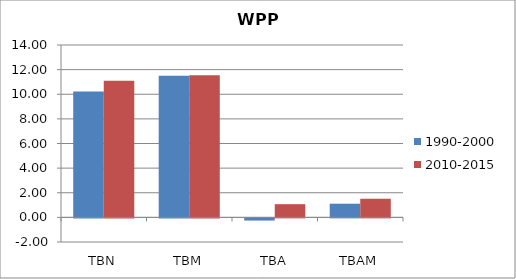
| Category | 1990-2000 | 2010-2015 |
|---|---|---|
| TBN | 10.223 | 11.09 |
| TBM | 11.51 | 11.534 |
| TBA | -0.177 | 1.069 |
| TBAM | 1.11 | 1.513 |